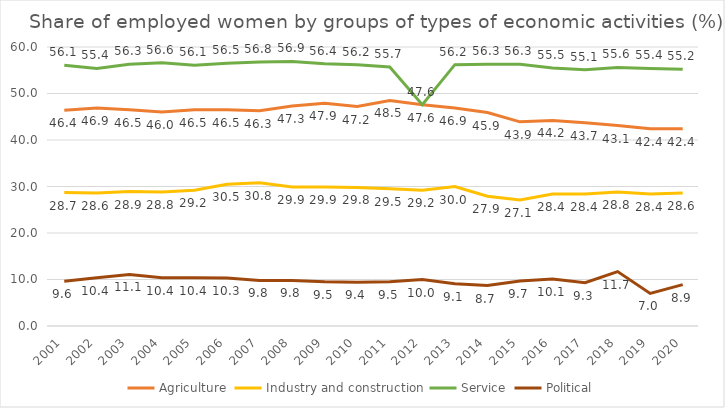
| Category | Agriculture | Industry and construction | Service | Political |
|---|---|---|---|---|
| 2001.0 | 46.4 | 28.7 | 56.1 | 9.6 |
| 2002.0 | 46.9 | 28.6 | 55.4 | 10.4 |
| 2003.0 | 46.5 | 28.9 | 56.3 | 11.1 |
| 2004.0 | 46 | 28.8 | 56.6 | 10.4 |
| 2005.0 | 46.5 | 29.2 | 56.1 | 10.4 |
| 2006.0 | 46.5 | 30.5 | 56.5 | 10.3 |
| 2007.0 | 46.3 | 30.8 | 56.8 | 9.8 |
| 2008.0 | 47.3 | 29.9 | 56.9 | 9.8 |
| 2009.0 | 47.9 | 29.9 | 56.4 | 9.5 |
| 2010.0 | 47.2 | 29.8 | 56.2 | 9.4 |
| 2011.0 | 48.5 | 29.5 | 55.7 | 9.5 |
| 2012.0 | 47.6 | 29.2 | 47.6 | 10 |
| 2013.0 | 46.9 | 30 | 56.2 | 9.1 |
| 2014.0 | 45.9 | 27.9 | 56.3 | 8.7 |
| 2015.0 | 43.9 | 27.1 | 56.3 | 9.7 |
| 2016.0 | 44.2 | 28.4 | 55.5 | 10.1 |
| 2017.0 | 43.7 | 28.4 | 55.1 | 9.3 |
| 2018.0 | 43.1 | 28.8 | 55.6 | 11.7 |
| 2019.0 | 42.4 | 28.4 | 55.4 | 7.01 |
| 2020.0 | 42.4 | 28.6 | 55.2 | 8.9 |